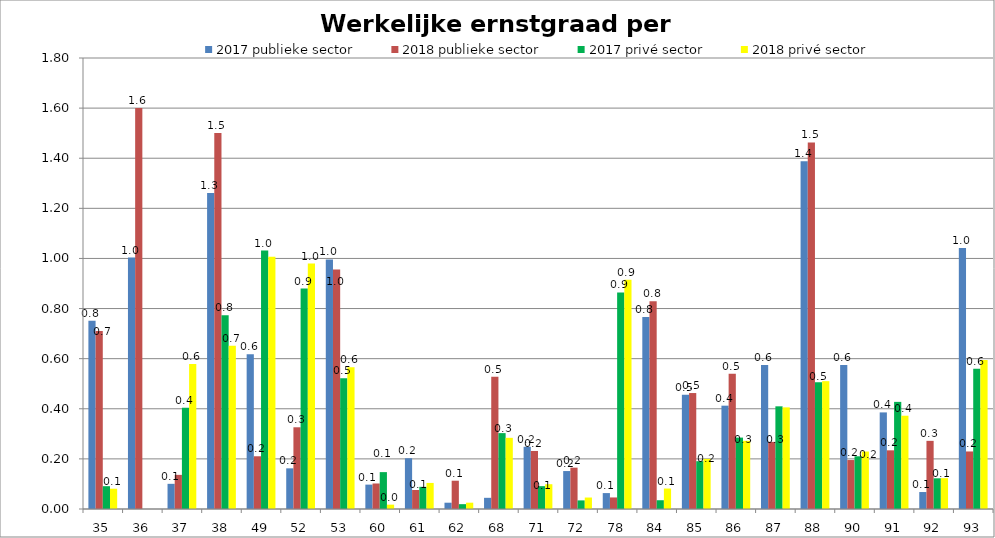
| Category | 2017 publieke sector | 2018 publieke sector | 2017 privé sector | 2018 privé sector |
|---|---|---|---|---|
| 35 | 0.751 | 0.711 | 0.091 | 0.081 |
| 36 | 1.003 | 1.6 | 0 | 0 |
| 37 | 0.1 | 0.136 | 0.405 | 0.579 |
| 38 | 1.261 | 1.5 | 0.773 | 0.652 |
| 49 | 0.618 | 0.21 | 1.031 | 1.007 |
| 52 | 0.162 | 0.326 | 0.88 | 0.979 |
| 53 | 0.996 | 0.956 | 0.522 | 0.566 |
| 60 | 0.097 | 0.102 | 0.147 | 0.017 |
| 61 | 0.203 | 0.076 | 0.088 | 0.104 |
| 62 | 0.025 | 0.113 | 0.019 | 0.025 |
| 68 | 0.045 | 0.527 | 0.303 | 0.284 |
| 71 | 0.248 | 0.232 | 0.091 | 0.099 |
| 72 | 0.151 | 0.165 | 0.034 | 0.046 |
| 78 | 0.064 | 0.046 | 0.865 | 0.915 |
| 84 | 0.767 | 0.829 | 0.035 | 0.082 |
| 85 | 0.456 | 0.463 | 0.191 | 0.2 |
| 86 | 0.412 | 0.54 | 0.285 | 0.272 |
| 87 | 0.574 | 0.268 | 0.41 | 0.406 |
| 88 | 1.388 | 1.463 | 0.506 | 0.51 |
| 90 | 0.575 | 0.195 | 0.21 | 0.229 |
| 91 | 0.386 | 0.234 | 0.428 | 0.372 |
| 92 | 0.068 | 0.272 | 0.123 | 0.123 |
| 93 | 1.042 | 0.23 | 0.56 | 0.595 |